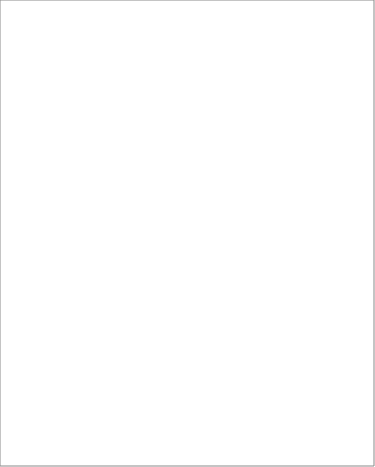
| Category | Series 0 |
|---|---|
| Energoefektivitātes politika, ekonomikas veicināšana, atbalsts biodegvielas ražošanas veicināšanai | 3617462 |
| Mērķdotācijas autoceļiem un to pārvaldīšana | 89675980 |
| Vispārējie ekonomiskie, komerciālie un nodarbinātības publiskie pakalpojumi | 6409374 |
| Dotācijas sabiedriskā transporta pārvadājumu organizēšana, zaudējumu segšanai un lidostai "Rīga" | 58580431 |
| Valsts atbalsts lauksaimniecībai un lauku attīstībai, lauksaimniecības risku fonds un citi atbalsta pasākumi mežu nozarē un zivsaimniecībā | 11206330 |
| Tūrisma attīstība, datordrošība, pasta darbība, pašvaldību un reģionu pārvaldes pakalpojumi | 5702649 |